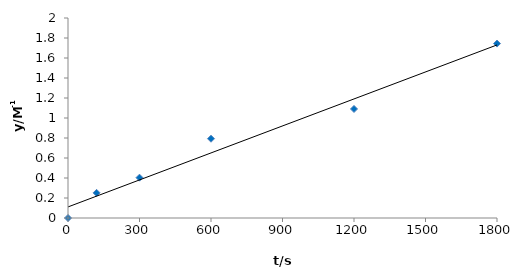
| Category | Series 0 |
|---|---|
| 0.0 | 0 |
| 120.0 | 0.251 |
| 300.0 | 0.403 |
| 600.0 | 0.793 |
| 1200.0 | 1.09 |
| 1800.0 | 1.744 |